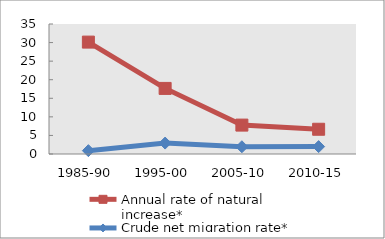
| Category | Annual rate of natural increase* | Crude net migration rate* |
|---|---|---|
| 1985-90 | 30.126 | 0.904 |
| 1995-00 | 17.656 | 2.941 |
| 2005-10 | 7.782 | 1.948 |
| 2010-15 | 6.66 | 1.987 |